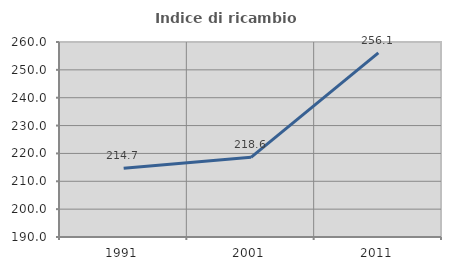
| Category | Indice di ricambio occupazionale  |
|---|---|
| 1991.0 | 214.66 |
| 2001.0 | 218.593 |
| 2011.0 | 256.122 |